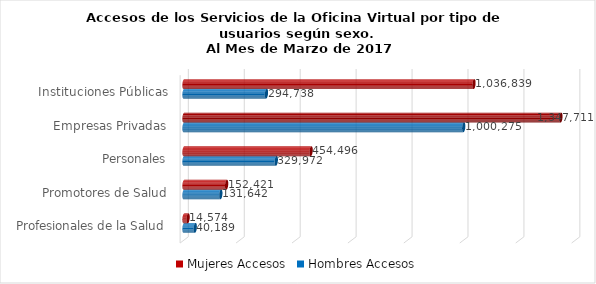
| Category | Mujeres | Hombres |
|---|---|---|
| Instituciones Públicas | 1036839 | 294738 |
| Empresas Privadas | 1347711 | 1000275 |
| Personales | 454496 | 329972 |
| Promotores de Salud | 152421 | 131642 |
| Profesionales de la Salud | 14574 | 40189 |